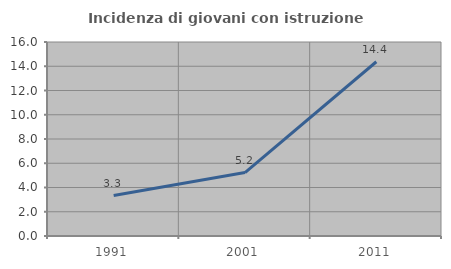
| Category | Incidenza di giovani con istruzione universitaria |
|---|---|
| 1991.0 | 3.333 |
| 2001.0 | 5.229 |
| 2011.0 | 14.372 |